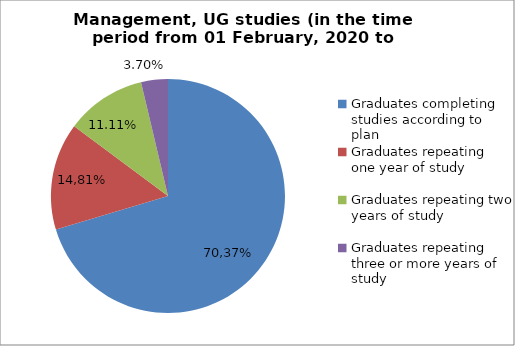
| Category | Series 0 |
|---|---|
| Graduates completing studies according to plan | 70.37 |
| Graduates repeating one year of study | 14.815 |
| Graduates repeating two years of study | 11.111 |
| Graduates repeating three or more years of study | 3.704 |